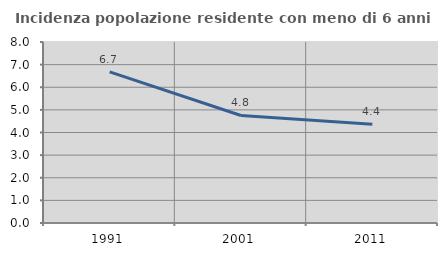
| Category | Incidenza popolazione residente con meno di 6 anni |
|---|---|
| 1991.0 | 6.679 |
| 2001.0 | 4.753 |
| 2011.0 | 4.361 |